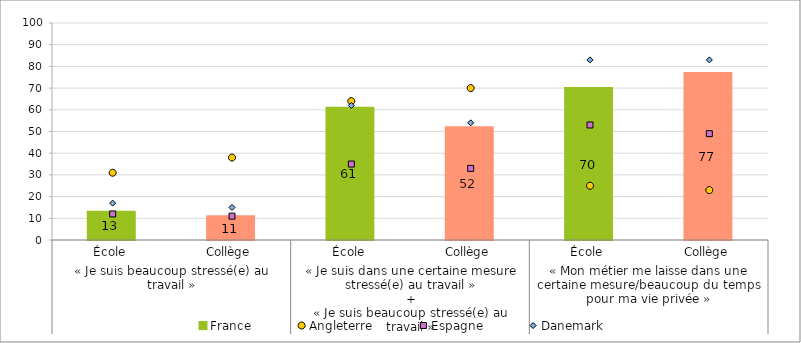
| Category | France |
|---|---|
| 0 | 13 |
| 1 | 11 |
| 2 | 61 |
| 3 | 52 |
| 4 | 70 |
| 5 | 77 |